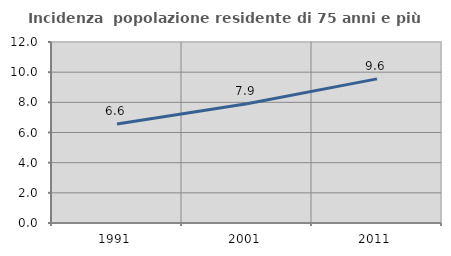
| Category | Incidenza  popolazione residente di 75 anni e più |
|---|---|
| 1991.0 | 6.566 |
| 2001.0 | 7.905 |
| 2011.0 | 9.555 |